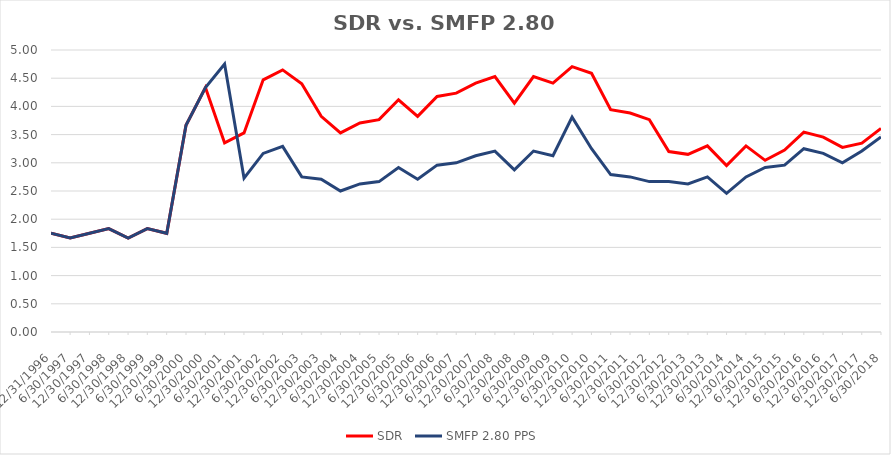
| Category | SDR | SMFP 2.80 PPS |
|---|---|---|
| 12/31/96 | 1.75 | 1.75 |
| 6/30/97 | 1.667 | 1.667 |
| 12/31/97 | 1.75 | 1.75 |
| 6/30/98 | 1.833 | 1.833 |
| 12/31/98 | 1.667 | 1.667 |
| 6/30/99 | 1.833 | 1.833 |
| 12/31/99 | 1.75 | 1.75 |
| 6/30/00 | 3.667 | 3.667 |
| 12/31/00 | 4.333 | 4.333 |
| 6/30/01 | 3.353 | 4.75 |
| 12/31/01 | 3.529 | 2.727 |
| 6/30/02 | 4.471 | 3.167 |
| 12/31/02 | 4.647 | 3.292 |
| 6/30/03 | 4.4 | 2.75 |
| 12/31/03 | 3.824 | 2.708 |
| 6/30/04 | 3.529 | 2.5 |
| 12/31/04 | 3.706 | 2.625 |
| 6/30/05 | 3.765 | 2.667 |
| 12/31/05 | 4.118 | 2.917 |
| 6/30/06 | 3.824 | 2.708 |
| 12/31/06 | 4.176 | 2.958 |
| 6/30/07 | 4.235 | 3 |
| 12/31/07 | 4.412 | 3.125 |
| 6/30/08 | 4.529 | 3.208 |
| 12/31/08 | 4.059 | 2.875 |
| 6/30/09 | 4.529 | 3.208 |
| 12/31/09 | 4.412 | 3.125 |
| 6/30/10 | 4.706 | 3.81 |
| 12/31/10 | 4.588 | 3.25 |
| 6/30/11 | 3.941 | 2.792 |
| 12/31/11 | 3.882 | 2.75 |
| 6/30/12 | 3.765 | 2.667 |
| 12/31/12 | 3.2 | 2.667 |
| 6/30/13 | 3.15 | 2.625 |
| 12/31/13 | 3.3 | 2.75 |
| 6/30/14 | 2.95 | 2.458 |
| 12/31/14 | 3.3 | 2.75 |
| 6/30/15 | 3.043 | 2.917 |
| 12/31/15 | 3.227 | 2.958 |
| 6/30/16 | 3.545 | 3.25 |
| 12/31/16 | 3.455 | 3.167 |
| 6/30/17 | 3.273 | 3 |
| 12/31/17 | 3.348 | 3.208 |
| 6/30/18 | 3.609 | 3.458 |